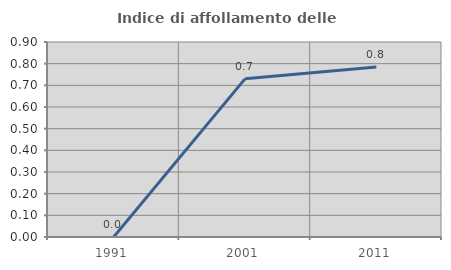
| Category | Indice di affollamento delle abitazioni  |
|---|---|
| 1991.0 | 0 |
| 2001.0 | 0.73 |
| 2011.0 | 0.784 |